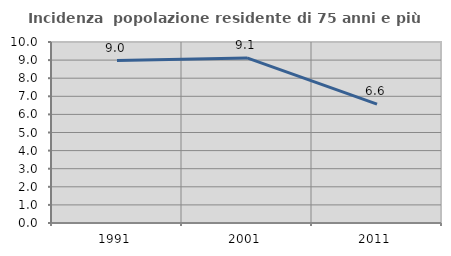
| Category | Incidenza  popolazione residente di 75 anni e più |
|---|---|
| 1991.0 | 8.975 |
| 2001.0 | 9.123 |
| 2011.0 | 6.569 |